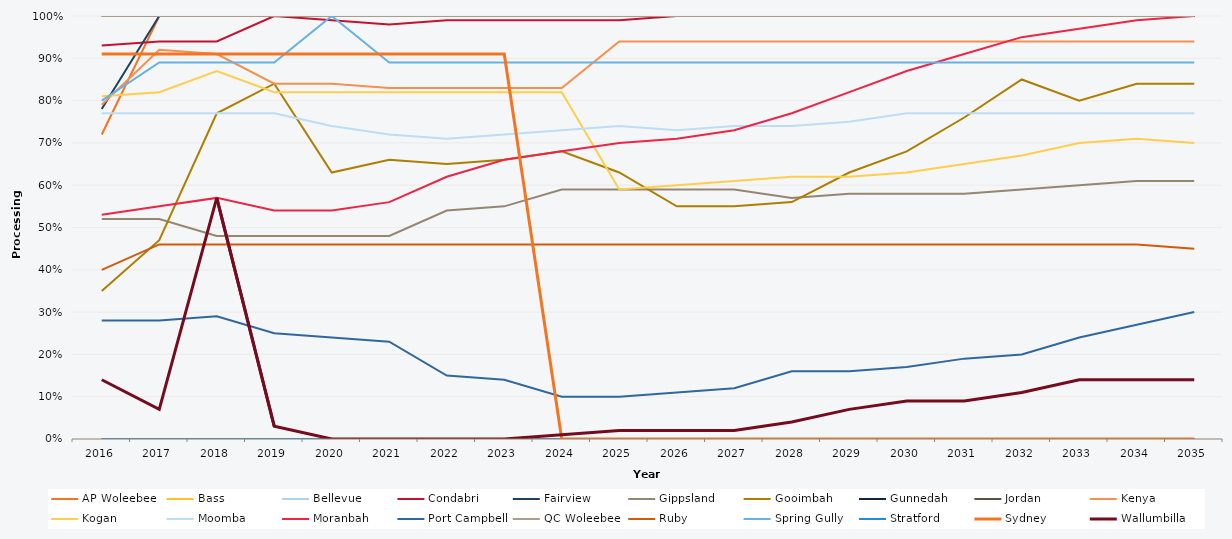
| Category | AP Woleebee | Bass | Bellevue | Condabri | Fairview | Gippsland | Gooimbah | Gunnedah | Jordan | Kenya | Kogan | Moomba | Moranbah | Port Campbell | QC Woleebee | Ruby | Spring Gully | Stratford | Sydney | Wallumbilla |
|---|---|---|---|---|---|---|---|---|---|---|---|---|---|---|---|---|---|---|---|---|
| 2016.0 | 0.72 | 1 | 1 | 0.93 | 0.78 | 0.52 | 0.35 | 0 | 1 | 0.79 | 0.81 | 0.77 | 0.53 | 0.28 | 1 | 0.4 | 0.8 | 0 | 0.91 | 0.14 |
| 2017.0 | 1 | 1 | 1 | 0.94 | 1 | 0.52 | 0.47 | 0 | 1 | 0.92 | 0.82 | 0.77 | 0.55 | 0.28 | 1 | 0.46 | 0.89 | 0 | 0.91 | 0.07 |
| 2018.0 | 1 | 1 | 1 | 0.94 | 1 | 0.48 | 0.77 | 0 | 1 | 0.91 | 0.87 | 0.77 | 0.57 | 0.29 | 1 | 0.46 | 0.89 | 0 | 0.91 | 0.57 |
| 2019.0 | 1 | 1 | 1 | 1 | 1 | 0.48 | 0.84 | 0 | 1 | 0.84 | 0.82 | 0.77 | 0.54 | 0.25 | 1 | 0.46 | 0.89 | 0 | 0.91 | 0.03 |
| 2020.0 | 1 | 1 | 1 | 0.99 | 1 | 0.48 | 0.63 | 0 | 1 | 0.84 | 0.82 | 0.74 | 0.54 | 0.24 | 1 | 0.46 | 1 | 0 | 0.91 | 0 |
| 2021.0 | 1 | 1 | 1 | 0.98 | 1 | 0.48 | 0.66 | 0 | 1 | 0.83 | 0.82 | 0.72 | 0.56 | 0.23 | 1 | 0.46 | 0.89 | 0 | 0.91 | 0 |
| 2022.0 | 1 | 1 | 1 | 0.99 | 1 | 0.54 | 0.65 | 0 | 1 | 0.83 | 0.82 | 0.71 | 0.62 | 0.15 | 1 | 0.46 | 0.89 | 0 | 0.91 | 0 |
| 2023.0 | 1 | 1 | 1 | 0.99 | 1 | 0.55 | 0.66 | 0 | 1 | 0.83 | 0.82 | 0.72 | 0.66 | 0.14 | 1 | 0.46 | 0.89 | 0 | 0.91 | 0 |
| 2024.0 | 1 | 1 | 1 | 0.99 | 1 | 0.59 | 0.68 | 0 | 1 | 0.83 | 0.82 | 0.73 | 0.68 | 0.1 | 1 | 0.46 | 0.89 | 0 | 0 | 0.01 |
| 2025.0 | 1 | 1 | 1 | 0.99 | 1 | 0.59 | 0.63 | 0 | 1 | 0.94 | 0.59 | 0.74 | 0.7 | 0.1 | 1 | 0.46 | 0.89 | 0 | 0 | 0.02 |
| 2026.0 | 1 | 1 | 1 | 1 | 1 | 0.59 | 0.55 | 0 | 1 | 0.94 | 0.6 | 0.73 | 0.71 | 0.11 | 1 | 0.46 | 0.89 | 0 | 0 | 0.02 |
| 2027.0 | 1 | 1 | 1 | 1 | 1 | 0.59 | 0.55 | 0 | 1 | 0.94 | 0.61 | 0.74 | 0.73 | 0.12 | 1 | 0.46 | 0.89 | 0 | 0 | 0.02 |
| 2028.0 | 1 | 1 | 1 | 1 | 1 | 0.57 | 0.56 | 0 | 1 | 0.94 | 0.62 | 0.74 | 0.77 | 0.16 | 1 | 0.46 | 0.89 | 0 | 0 | 0.04 |
| 2029.0 | 1 | 1 | 1 | 1 | 1 | 0.58 | 0.63 | 0 | 1 | 0.94 | 0.62 | 0.75 | 0.82 | 0.16 | 1 | 0.46 | 0.89 | 0 | 0 | 0.07 |
| 2030.0 | 1 | 1 | 1 | 1 | 1 | 0.58 | 0.68 | 0 | 1 | 0.94 | 0.63 | 0.77 | 0.87 | 0.17 | 1 | 0.46 | 0.89 | 0 | 0 | 0.09 |
| 2031.0 | 1 | 1 | 1 | 1 | 1 | 0.58 | 0.76 | 0 | 1 | 0.94 | 0.65 | 0.77 | 0.91 | 0.19 | 1 | 0.46 | 0.89 | 0 | 0 | 0.09 |
| 2032.0 | 1 | 1 | 1 | 1 | 1 | 0.59 | 0.85 | 0 | 1 | 0.94 | 0.67 | 0.77 | 0.95 | 0.2 | 1 | 0.46 | 0.89 | 0 | 0 | 0.11 |
| 2033.0 | 1 | 1 | 1 | 1 | 1 | 0.6 | 0.8 | 0 | 1 | 0.94 | 0.7 | 0.77 | 0.97 | 0.24 | 1 | 0.46 | 0.89 | 0 | 0 | 0.14 |
| 2034.0 | 1 | 1 | 1 | 1 | 1 | 0.61 | 0.84 | 0 | 1 | 0.94 | 0.71 | 0.77 | 0.99 | 0.27 | 1 | 0.46 | 0.89 | 0 | 0 | 0.14 |
| 2035.0 | 1 | 1 | 1 | 1 | 1 | 0.61 | 0.84 | 0 | 1 | 0.94 | 0.7 | 0.77 | 1 | 0.3 | 1 | 0.45 | 0.89 | 0 | 0 | 0.14 |